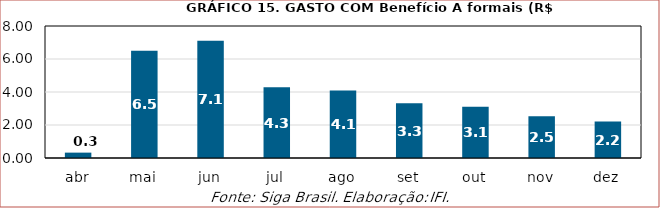
| Category | BEm |
|---|---|
| abr | 0.325 |
| mai | 6.506 |
| jun | 7.113 |
| jul | 4.292 |
| ago | 4.093 |
| set | 3.32 |
| out | 3.101 |
| nov | 2.537 |
| dez | 2.217 |